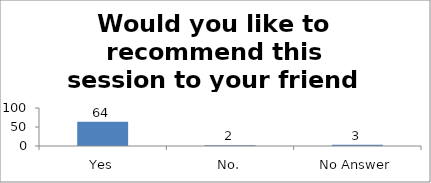
| Category | Would you like to recommend this session to your friend or colleague? |
|---|---|
| Yes | 64 |
| No. | 2 |
| No Answer | 3 |